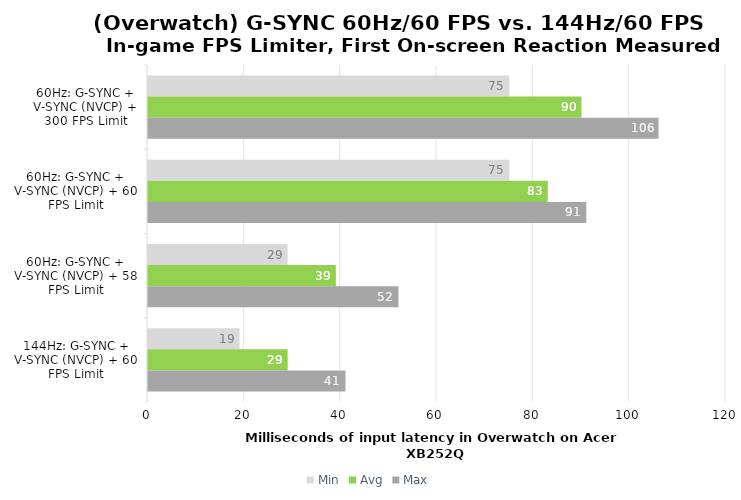
| Category | Min | Avg | Max |
|---|---|---|---|
| 60Hz: G-SYNC + V-SYNC (NVCP) + 300 FPS Limit | 75 | 90 | 106 |
| 60Hz: G-SYNC + V-SYNC (NVCP) + 60 FPS Limit | 75 | 83 | 91 |
| 60Hz: G-SYNC + V-SYNC (NVCP) + 58 FPS Limit | 29 | 39 | 52 |
| 144Hz: G-SYNC + V-SYNC (NVCP) + 60 FPS Limit | 19 | 29 | 41 |